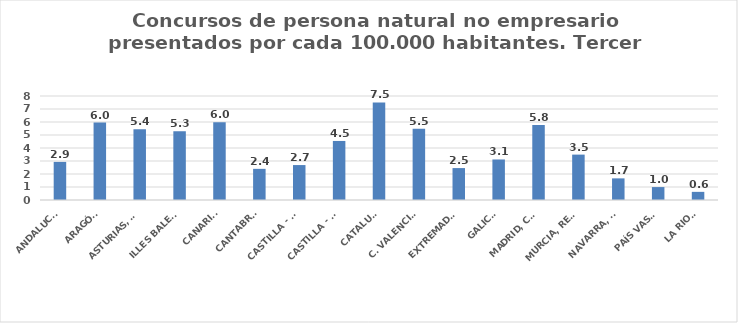
| Category | Series 0 |
|---|---|
| ANDALUCÍA | 2.93 |
| ARAGÓN | 5.961 |
| ASTURIAS, PRINCIPADO | 5.437 |
| ILLES BALEARS | 5.289 |
| CANARIAS | 5.987 |
| CANTABRIA | 2.396 |
| CASTILLA - LEÓN | 2.688 |
| CASTILLA - LA MANCHA | 4.541 |
| CATALUÑA | 7.503 |
| C. VALENCIANA | 5.486 |
| EXTREMADURA | 2.456 |
| GALICIA | 3.118 |
| MADRID, COMUNIDAD | 5.767 |
| MURCIA, REGIÓN | 3.492 |
| NAVARRA, COM. FORAL | 1.664 |
| PAÍS VASCO | 0.994 |
| LA RIOJA | 0.627 |